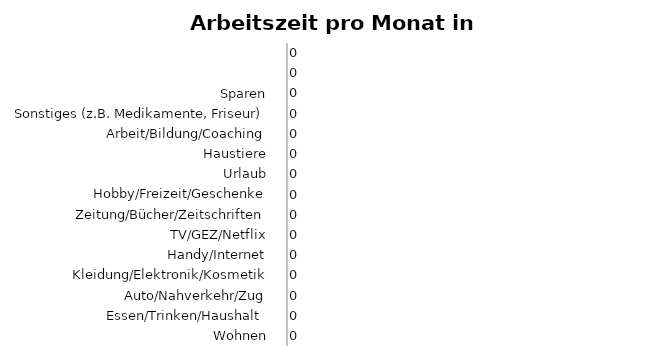
| Category | Series 0 |
|---|---|
| Wohnen | 0 |
| Essen/Trinken/Haushalt  | 0 |
| Auto/Nahverkehr/Zug | 0 |
| Kleidung/Elektronik/Kosmetik | 0 |
| Handy/Internet | 0 |
| TV/GEZ/Netflix | 0 |
| Versicherung, Altersvorsorge | 0 |
| Konsumkredit (z.B. Auto, Küche) | 0 |
| Zeitung/Bücher/Zeitschriften | 0 |
| Hobby/Freizeit/Geschenke | 0 |
| Urlaub | 0 |
| Haustiere | 0 |
| Arbeit/Bildung/Coaching | 0 |
| Sonstiges (z.B. Medikamente, Friseur) | 0 |
| Sparen | 0 |